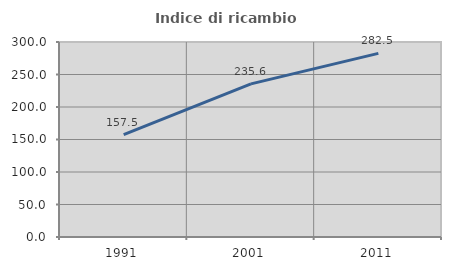
| Category | Indice di ricambio occupazionale  |
|---|---|
| 1991.0 | 157.524 |
| 2001.0 | 235.556 |
| 2011.0 | 282.529 |